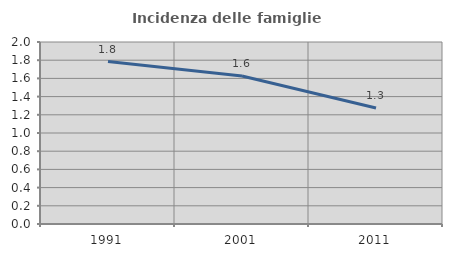
| Category | Incidenza delle famiglie numerose |
|---|---|
| 1991.0 | 1.786 |
| 2001.0 | 1.627 |
| 2011.0 | 1.274 |